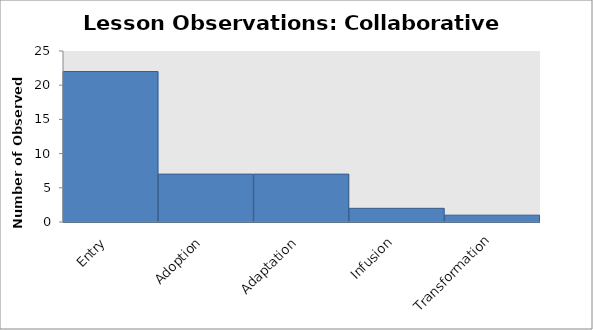
| Category | Lessons |
|---|---|
| Entry | 22 |
| Adoption | 7 |
| Adaptation | 7 |
| Infusion | 2 |
| Transformation | 1 |